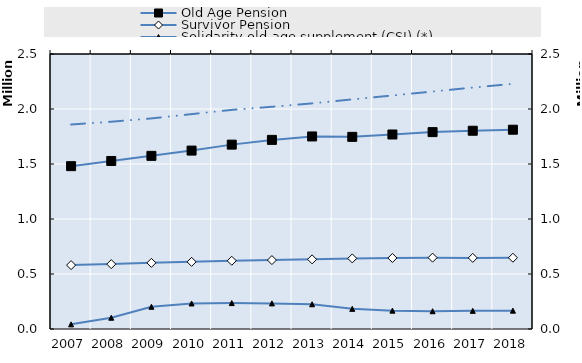
| Category | Old Age Pension | Survivor Pension | Series 4 | Series 5 | Series 6 | Series 7 | Series 8 | Series 9 | Series 10 | Series 11 | Series 12 | Series 13 | Series 14 | Series 15 | Series 16 | Series 17 | Series 18 | Series 19 |
|---|---|---|---|---|---|---|---|---|---|---|---|---|---|---|---|---|---|---|
| 2007.0 | 1480409 | 580740 |  |  |  |  |  |  |  |  |  |  |  |  |  |  |  |  |
| 2008.0 | 1527472 | 589839 |  |  |  |  |  |  |  |  |  |  |  |  |  |  |  |  |
| 2009.0 | 1573946 | 601149 |  |  |  |  |  |  |  |  |  |  |  |  |  |  |  |  |
| 2010.0 | 1621901 | 610342 |  |  |  |  |  |  |  |  |  |  |  |  |  |  |  |  |
| 2011.0 | 1676121 | 620167 |  |  |  |  |  |  |  |  |  |  |  |  |  |  |  |  |
| 2012.0 | 1719131 | 626524 |  |  |  |  |  |  |  |  |  |  |  |  |  |  |  |  |
| 2013.0 | 1750458 | 633185 |  |  |  |  |  |  |  |  |  |  |  |  |  |  |  |  |
| 2014.0 | 1746749 | 641860 |  |  |  |  |  |  |  |  |  |  |  |  |  |  |  |  |
| 2015.0 | 1768192 | 645726 |  |  |  |  |  |  |  |  |  |  |  |  |  |  |  |  |
| 2016.0 | 1789913 | 648454 |  |  |  |  |  |  |  |  |  |  |  |  |  |  |  |  |
| 2017.0 | 1802277 | 646453 |  |  |  |  |  |  |  |  |  |  |  |  |  |  |  |  |
| 2018.0 | 1811746 | 647861 |  |  |  |  |  |  |  |  |  |  |  |  |  |  |  |  |